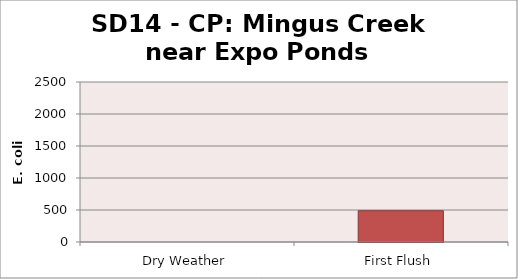
| Category | E. coli MPN |
|---|---|
| Dry Weather | 0 |
| First Flush | 488.4 |